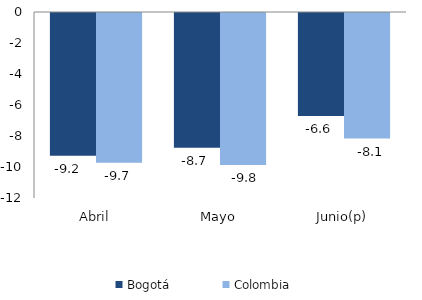
| Category | Bogotá | Colombia |
|---|---|---|
| Abril | -9.205 | -9.665 |
| Mayo | -8.695 | -9.81 |
| Junio(p) | -6.642 | -8.097 |